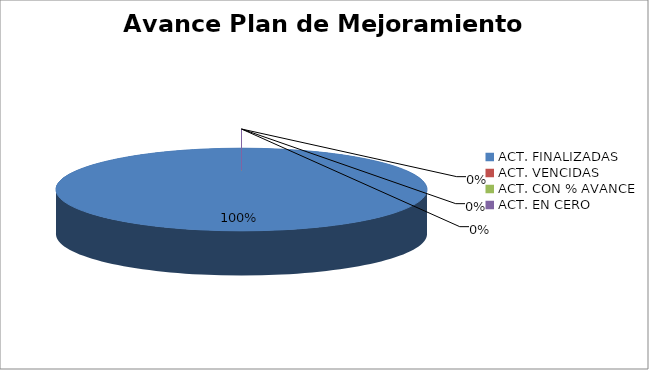
| Category | Series 0 | Series 1 |
|---|---|---|
| ACT. FINALIZADAS | 9 |  |
| ACT. VENCIDAS | 0 |  |
| ACT. CON % AVANCE | 0 |  |
| ACT. EN CERO | 0 |  |